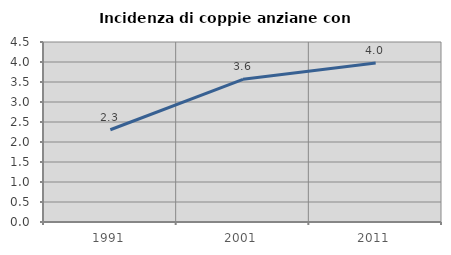
| Category | Incidenza di coppie anziane con figli |
|---|---|
| 1991.0 | 2.306 |
| 2001.0 | 3.568 |
| 2011.0 | 3.974 |